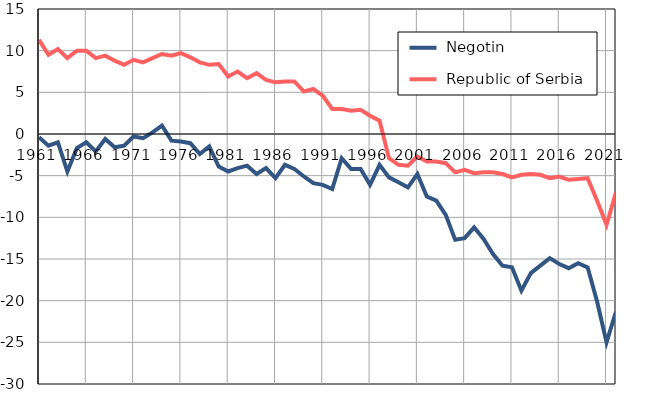
| Category |  Negotin |  Republic of Serbia |
|---|---|---|
| 1961.0 | -0.4 | 11.3 |
| 1962.0 | -1.4 | 9.5 |
| 1963.0 | -1 | 10.2 |
| 1964.0 | -4.5 | 9.1 |
| 1965.0 | -1.7 | 10 |
| 1966.0 | -1 | 10 |
| 1967.0 | -2.1 | 9.1 |
| 1968.0 | -0.6 | 9.4 |
| 1969.0 | -1.6 | 8.8 |
| 1970.0 | -1.4 | 8.3 |
| 1971.0 | -0.3 | 8.9 |
| 1972.0 | -0.5 | 8.6 |
| 1973.0 | 0.2 | 9.1 |
| 1974.0 | 1 | 9.6 |
| 1975.0 | -0.8 | 9.4 |
| 1976.0 | -0.9 | 9.7 |
| 1977.0 | -1.1 | 9.2 |
| 1978.0 | -2.4 | 8.6 |
| 1979.0 | -1.5 | 8.3 |
| 1980.0 | -3.9 | 8.4 |
| 1981.0 | -4.5 | 6.9 |
| 1982.0 | -4.1 | 7.5 |
| 1983.0 | -3.8 | 6.7 |
| 1984.0 | -4.8 | 7.3 |
| 1985.0 | -4.1 | 6.5 |
| 1986.0 | -5.3 | 6.2 |
| 1987.0 | -3.7 | 6.3 |
| 1988.0 | -4.2 | 6.3 |
| 1989.0 | -5.1 | 5.1 |
| 1990.0 | -5.9 | 5.4 |
| 1991.0 | -6.1 | 4.6 |
| 1992.0 | -6.6 | 3 |
| 1993.0 | -2.9 | 3 |
| 1994.0 | -4.2 | 2.8 |
| 1995.0 | -4.2 | 2.9 |
| 1996.0 | -6.1 | 2.2 |
| 1997.0 | -3.7 | 1.6 |
| 1998.0 | -5.2 | -2.9 |
| 1999.0 | -5.8 | -3.7 |
| 2000.0 | -6.4 | -3.8 |
| 2001.0 | -4.8 | -2.7 |
| 2002.0 | -7.5 | -3.3 |
| 2003.0 | -8 | -3.3 |
| 2004.0 | -9.7 | -3.5 |
| 2005.0 | -12.7 | -4.6 |
| 2006.0 | -12.5 | -4.3 |
| 2007.0 | -11.2 | -4.7 |
| 2008.0 | -12.6 | -4.6 |
| 2009.0 | -14.4 | -4.6 |
| 2010.0 | -15.8 | -4.8 |
| 2011.0 | -16 | -5.2 |
| 2012.0 | -18.8 | -4.9 |
| 2013.0 | -16.7 | -4.8 |
| 2014.0 | -15.8 | -4.9 |
| 2015.0 | -14.9 | -5.3 |
| 2016.0 | -15.6 | -5.1 |
| 2017.0 | -16.1 | -5.5 |
| 2018.0 | -15.5 | -5.4 |
| 2019.0 | -16 | -5.3 |
| 2020.0 | -20.1 | -8 |
| 2021.0 | -25 | -10.9 |
| 2022.0 | -21.3 | -7 |